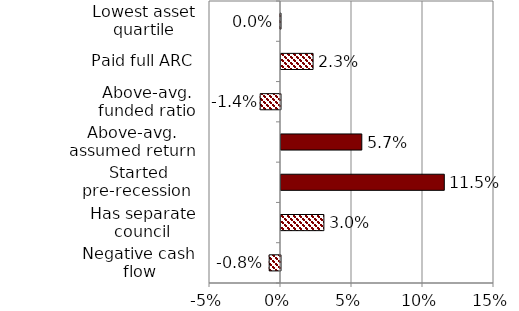
| Category | Series 1 |
|---|---|
| Negative cash flow | -0.008 |
| Has separate council | 0.03 |
| Started pre-recession  | 0.115 |
| Above-avg. assumed return | 0.057 |
| Above-avg. funded ratio | -0.014 |
| Paid full ARC | 0.023 |
| Lowest asset quartile | 0 |